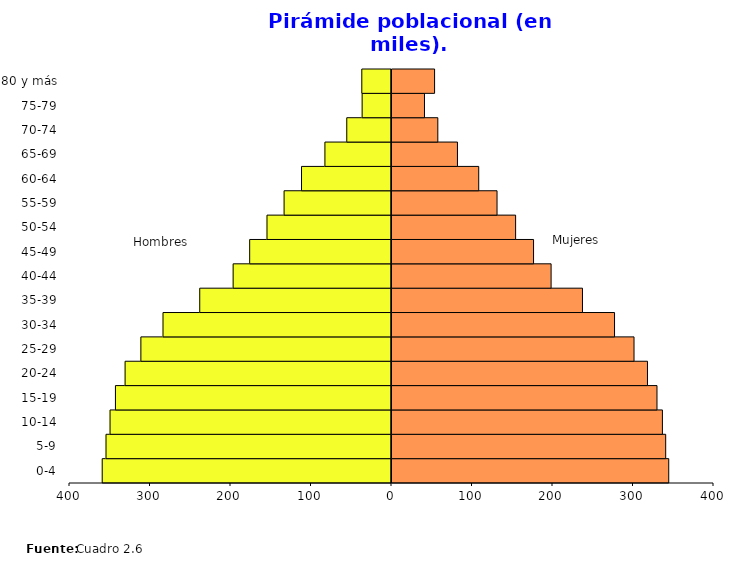
| Category | Hombres | Mujeres |
|---|---|---|
| 0-4 | -359.352 | 345.026 |
| 5-9 | -354.633 | 341.244 |
| 10-14 | -349.621 | 337.164 |
| 15-19 | -342.919 | 330.428 |
| 20-24 | -330.921 | 318.617 |
| 25-29 | -311.334 | 301.885 |
| 30-34 | -283.821 | 277.686 |
| 35-39 | -238.202 | 237.857 |
| 40-44 | -196.717 | 198.876 |
| 45-49 | -176.178 | 177.093 |
| 50-54 | -154.658 | 154.808 |
| 55-59 | -133.422 | 131.718 |
| 60-64 | -111.763 | 108.969 |
| 65-69 | -82.702 | 82.559 |
| 70-74 | -55.551 | 58.164 |
| 75-79 | -36.46 | 41.599 |
| 80 y más | -36.886 | 54.151 |